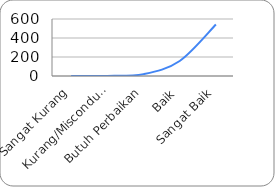
| Category | Pola Distribusi |
|---|---|
| Sangat Kurang | 0 |
| Kurang/Misconduct | 0.823 |
| Butuh Perbaikan | 19.748 |
| Baik | 157.986 |
| Sangat Baik | 541.667 |